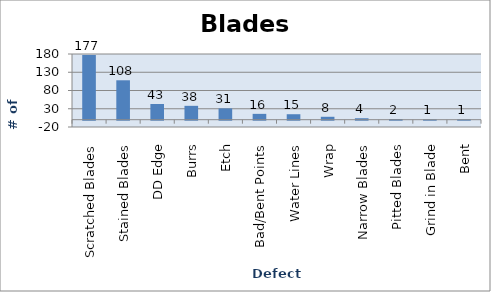
| Category | BLADES |
|---|---|
| Scratched Blades | 177 |
| Stained Blades | 108 |
| DD Edge | 43 |
| Burrs | 38 |
| Etch | 31 |
| Bad/Bent Points | 16 |
| Water Lines | 15 |
| Wrap | 8 |
| Narrow Blades | 4 |
| Pitted Blades | 2 |
| Grind in Blade | 1 |
| Bent | 1 |